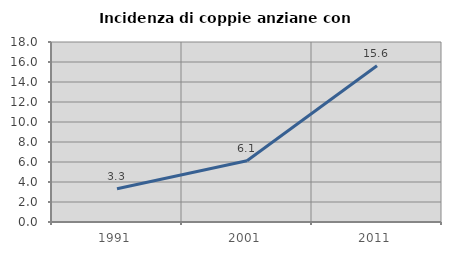
| Category | Incidenza di coppie anziane con figli |
|---|---|
| 1991.0 | 3.333 |
| 2001.0 | 6.122 |
| 2011.0 | 15.625 |